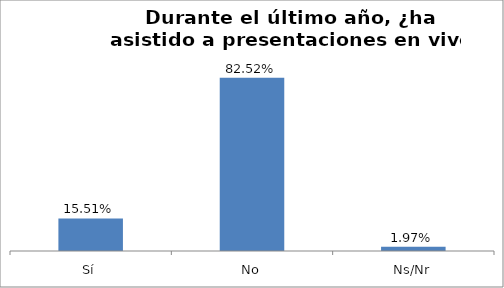
| Category | Total |
|---|---|
| Sí | 0.155 |
| No | 0.825 |
| Ns/Nr | 0.02 |